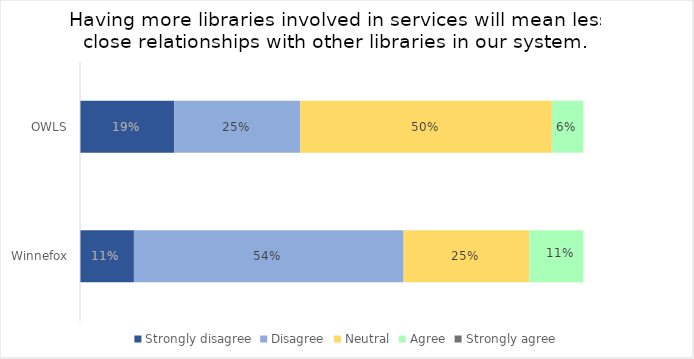
| Category | Strongly disagree | Disagree | Neutral | Agree | Strongly agree |
|---|---|---|---|---|---|
| OWLS | 0.188 | 0.25 | 0.5 | 0.062 | 0 |
| Winnefox | 0.107 | 0.536 | 0.25 | 0.107 | 0 |